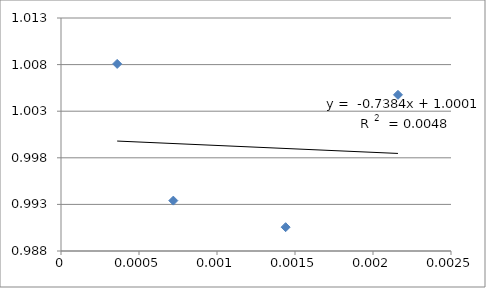
| Category | Series 0 |
|---|---|
| 0.00036 | 1.008 |
| 0.00072 | 0.993 |
| 0.00144 | 0.991 |
| 0.00216 | 1.005 |